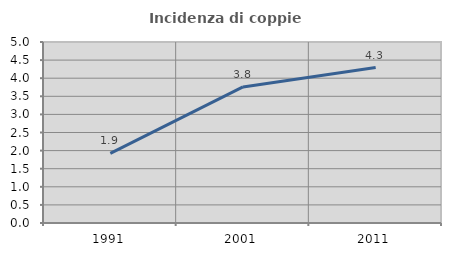
| Category | Incidenza di coppie miste |
|---|---|
| 1991.0 | 1.921 |
| 2001.0 | 3.758 |
| 2011.0 | 4.294 |